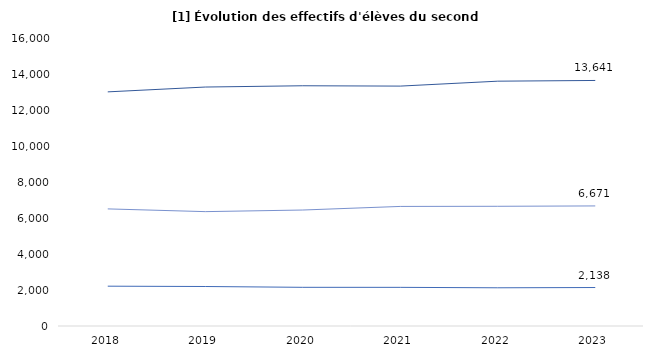
| Category | 1er cycle | 2nd cycle pro | #REF! | 2nd cycle GT |
|---|---|---|---|---|
| 2018 | 13007 | 2212 | 6506 |  |
| 2019 | 13276 | 2194 | 6354 |  |
| 2020 | 13347 | 2149 | 6443 |  |
| 2021 | 13328 | 2147 | 6643 |  |
| 2022 | 13601 | 2123 | 6651 |  |
| 2023 | 13641 | 2138 | 6671 |  |